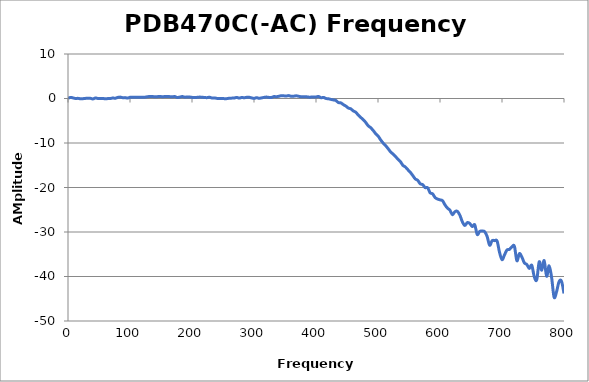
| Category | Series 0 |
|---|---|
| 0.3 | 0.06 |
| 4.2985 | 0.246 |
| 8.297 | 0.126 |
| 12.2955 | 0 |
| 16.294 | 0.032 |
| 20.2925 | -0.075 |
| 24.291 | -0.037 |
| 28.2895 | 0.027 |
| 32.288 | 0.033 |
| 36.2865 | 0.038 |
| 40.285 | -0.101 |
| 44.2835 | 0.121 |
| 48.282 | 0.002 |
| 52.2805 | 0.011 |
| 56.279 | 0.011 |
| 60.2775 | -0.073 |
| 64.276 | -0.019 |
| 68.2745 | -0.002 |
| 72.273 | 0.11 |
| 76.2715 | 0.048 |
| 80.27 | 0.245 |
| 84.2685 | 0.312 |
| 88.267 | 0.18 |
| 92.2655 | 0.195 |
| 96.264 | 0.104 |
| 100.263 | 0.274 |
| 104.261 | 0.289 |
| 108.26 | 0.299 |
| 112.258 | 0.293 |
| 116.257 | 0.281 |
| 120.255 | 0.274 |
| 124.254 | 0.301 |
| 128.252 | 0.397 |
| 132.251 | 0.446 |
| 136.249 | 0.443 |
| 140.248 | 0.375 |
| 144.246 | 0.417 |
| 148.245 | 0.456 |
| 152.243 | 0.403 |
| 156.242 | 0.438 |
| 160.24 | 0.44 |
| 164.239 | 0.421 |
| 168.237 | 0.375 |
| 172.236 | 0.446 |
| 176.234 | 0.227 |
| 180.233 | 0.314 |
| 184.231 | 0.439 |
| 188.23 | 0.307 |
| 192.228 | 0.342 |
| 196.227 | 0.335 |
| 200.225 | 0.25 |
| 204.223 | 0.226 |
| 208.222 | 0.256 |
| 212.221 | 0.313 |
| 216.219 | 0.281 |
| 220.218 | 0.226 |
| 224.216 | 0.191 |
| 228.215 | 0.278 |
| 232.213 | 0.113 |
| 236.212 | 0.127 |
| 240.21 | 0.024 |
| 244.209 | 0.006 |
| 248.207 | 0.008 |
| 252.206 | -0.033 |
| 256.204 | -0.027 |
| 260.203 | 0.058 |
| 264.201 | 0.084 |
| 268.2 | 0.112 |
| 272.198 | 0.241 |
| 276.197 | 0.084 |
| 280.195 | 0.228 |
| 284.194 | 0.17 |
| 288.192 | 0.265 |
| 292.191 | 0.268 |
| 296.189 | 0.132 |
| 300.188 | 0.022 |
| 304.186 | 0.18 |
| 308.185 | 0.04 |
| 312.183 | 0.138 |
| 316.182 | 0.248 |
| 320.18 | 0.317 |
| 324.179 | 0.24 |
| 328.177 | 0.233 |
| 332.176 | 0.432 |
| 336.174 | 0.403 |
| 340.173 | 0.498 |
| 344.171 | 0.634 |
| 348.17 | 0.597 |
| 352.168 | 0.555 |
| 356.167 | 0.648 |
| 360.165 | 0.481 |
| 364.164 | 0.523 |
| 368.162 | 0.6 |
| 372.161 | 0.498 |
| 376.159 | 0.391 |
| 380.158 | 0.376 |
| 384.156 | 0.39 |
| 388.155 | 0.312 |
| 392.153 | 0.31 |
| 396.152 | 0.315 |
| 400.15 | 0.341 |
| 404.149 | 0.452 |
| 408.147 | 0.176 |
| 412.146 | 0.243 |
| 416.144 | -0.001 |
| 420.143 | -0.066 |
| 424.141 | -0.2 |
| 428.14 | -0.325 |
| 432.138 | -0.45 |
| 436.137 | -0.915 |
| 440.135 | -0.983 |
| 444.133 | -1.383 |
| 448.132 | -1.699 |
| 452.131 | -2.14 |
| 456.129 | -2.325 |
| 460.128 | -2.791 |
| 464.126 | -3.078 |
| 468.124 | -3.725 |
| 472.123 | -4.245 |
| 476.122 | -4.764 |
| 480.12 | -5.359 |
| 484.119 | -6.129 |
| 488.117 | -6.547 |
| 492.116 | -7.165 |
| 496.114 | -7.882 |
| 500.113 | -8.432 |
| 504.111 | -9.261 |
| 508.11 | -9.986 |
| 512.108 | -10.556 |
| 516.107 | -11.235 |
| 520.105 | -11.965 |
| 524.104 | -12.465 |
| 528.102 | -13.002 |
| 532.1 | -13.654 |
| 536.099 | -14.182 |
| 540.098 | -15.01 |
| 544.096 | -15.384 |
| 548.095 | -15.997 |
| 552.093 | -16.575 |
| 556.092 | -17.308 |
| 560.09 | -18.071 |
| 564.089 | -18.389 |
| 568.087 | -19.162 |
| 572.086 | -19.357 |
| 576.084 | -20.024 |
| 580.083 | -20.056 |
| 584.081 | -21.199 |
| 588.08 | -21.421 |
| 592.078 | -22.261 |
| 596.077 | -22.592 |
| 600.075 | -22.774 |
| 604.074 | -22.965 |
| 608.072 | -23.906 |
| 612.071 | -24.635 |
| 616.069 | -25.112 |
| 620.068 | -26.114 |
| 624.066 | -25.431 |
| 628.065 | -25.361 |
| 632.063 | -26.231 |
| 636.062 | -27.7 |
| 640.06 | -28.535 |
| 644.059 | -27.881 |
| 648.057 | -28.09 |
| 652.056 | -28.783 |
| 656.054 | -28.388 |
| 660.053 | -30.562 |
| 664.051 | -29.858 |
| 668.05 | -29.793 |
| 672.048 | -29.928 |
| 676.047 | -31.019 |
| 680.045 | -32.983 |
| 684.044 | -31.948 |
| 688.042 | -31.946 |
| 692.041 | -32.026 |
| 696.039 | -34.581 |
| 700.038 | -36.221 |
| 704.036 | -35.141 |
| 708.035 | -34.03 |
| 712.033 | -33.909 |
| 716.032 | -33.318 |
| 720.03 | -33.198 |
| 724.029 | -36.461 |
| 728.027 | -34.851 |
| 732.026 | -35.614 |
| 736.024 | -36.932 |
| 740.023 | -37.306 |
| 744.021 | -38.192 |
| 748.02 | -37.485 |
| 752.018 | -40.03 |
| 756.017 | -40.732 |
| 760.015 | -36.687 |
| 764.014 | -38.609 |
| 768.012 | -36.431 |
| 772.011 | -39.95 |
| 776.009 | -37.575 |
| 780.008 | -40.197 |
| 784.006 | -44.663 |
| 788.005 | -43.42 |
| 792.003 | -41.146 |
| 796.002 | -41.07 |
| 800.0 | -43.819 |